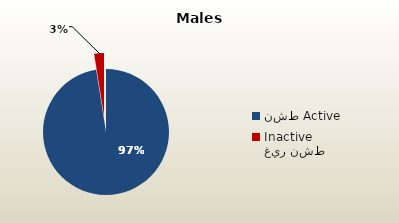
| Category | الذكور غير القطريين  Non-Qatari Males |
|---|---|
| نشط Active | 1741595 |
| غير نشط Inactive | 44777 |